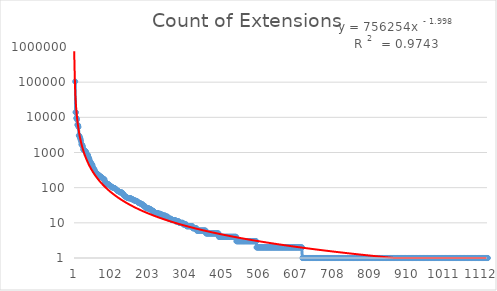
| Category | Count of Extensions |
|---|---|
| 0 | 104153 |
| 1 | 13996 |
| 2 | 13759 |
| 3 | 9446 |
| 4 | 9443 |
| 5 | 8591 |
| 6 | 6126 |
| 7 | 6024 |
| 8 | 5860 |
| 9 | 5290 |
| 10 | 3073 |
| 11 | 3002 |
| 12 | 2844 |
| 13 | 2682 |
| 14 | 2498 |
| 15 | 2293 |
| 16 | 2063 |
| 17 | 1717 |
| 18 | 1676 |
| 19 | 1636 |
| 20 | 1561 |
| 21 | 1460 |
| 22 | 1236 |
| 23 | 1194 |
| 24 | 1185 |
| 25 | 1151 |
| 26 | 1136 |
| 27 | 1109 |
| 28 | 1090 |
| 29 | 1051 |
| 30 | 1020 |
| 31 | 880 |
| 32 | 863 |
| 33 | 856 |
| 34 | 847 |
| 35 | 846 |
| 36 | 733 |
| 37 | 704 |
| 38 | 685 |
| 39 | 627 |
| 40 | 567 |
| 41 | 549 |
| 42 | 537 |
| 43 | 498 |
| 44 | 495 |
| 45 | 454 |
| 46 | 450 |
| 47 | 444 |
| 48 | 393 |
| 49 | 363 |
| 50 | 345 |
| 51 | 345 |
| 52 | 332 |
| 53 | 320 |
| 54 | 293 |
| 55 | 283 |
| 56 | 276 |
| 57 | 266 |
| 58 | 256 |
| 59 | 251 |
| 60 | 248 |
| 61 | 248 |
| 62 | 230 |
| 63 | 228 |
| 64 | 227 |
| 65 | 226 |
| 66 | 220 |
| 67 | 216 |
| 68 | 209 |
| 69 | 209 |
| 70 | 202 |
| 71 | 202 |
| 72 | 196 |
| 73 | 196 |
| 74 | 191 |
| 75 | 186 |
| 76 | 181 |
| 77 | 178 |
| 78 | 176 |
| 79 | 173 |
| 80 | 171 |
| 81 | 151 |
| 82 | 139 |
| 83 | 137 |
| 84 | 132 |
| 85 | 132 |
| 86 | 131 |
| 87 | 131 |
| 88 | 129 |
| 89 | 125 |
| 90 | 125 |
| 91 | 124 |
| 92 | 124 |
| 93 | 119 |
| 94 | 115 |
| 95 | 114 |
| 96 | 112 |
| 97 | 109 |
| 98 | 109 |
| 99 | 107 |
| 100 | 105 |
| 101 | 103 |
| 102 | 101 |
| 103 | 101 |
| 104 | 99 |
| 105 | 98 |
| 106 | 98 |
| 107 | 97 |
| 108 | 97 |
| 109 | 94 |
| 110 | 91 |
| 111 | 90 |
| 112 | 89 |
| 113 | 88 |
| 114 | 84 |
| 115 | 81 |
| 116 | 81 |
| 117 | 81 |
| 118 | 80 |
| 119 | 78 |
| 120 | 76 |
| 121 | 75 |
| 122 | 74 |
| 123 | 74 |
| 124 | 73 |
| 125 | 73 |
| 126 | 73 |
| 127 | 73 |
| 128 | 72 |
| 129 | 71 |
| 130 | 68 |
| 131 | 67 |
| 132 | 62 |
| 133 | 60 |
| 134 | 60 |
| 135 | 59 |
| 136 | 56 |
| 137 | 56 |
| 138 | 56 |
| 139 | 55 |
| 140 | 54 |
| 141 | 52 |
| 142 | 52 |
| 143 | 51 |
| 144 | 51 |
| 145 | 51 |
| 146 | 50 |
| 147 | 50 |
| 148 | 50 |
| 149 | 50 |
| 150 | 50 |
| 151 | 50 |
| 152 | 49 |
| 153 | 49 |
| 154 | 47 |
| 155 | 47 |
| 156 | 47 |
| 157 | 46 |
| 158 | 46 |
| 159 | 45 |
| 160 | 44 |
| 161 | 44 |
| 162 | 43 |
| 163 | 43 |
| 164 | 43 |
| 165 | 42 |
| 166 | 42 |
| 167 | 42 |
| 168 | 41 |
| 169 | 41 |
| 170 | 40 |
| 171 | 39 |
| 172 | 38 |
| 173 | 37 |
| 174 | 37 |
| 175 | 37 |
| 176 | 37 |
| 177 | 36 |
| 178 | 35 |
| 179 | 35 |
| 180 | 35 |
| 181 | 34 |
| 182 | 34 |
| 183 | 34 |
| 184 | 33 |
| 185 | 31 |
| 186 | 31 |
| 187 | 31 |
| 188 | 31 |
| 189 | 30 |
| 190 | 30 |
| 191 | 28 |
| 192 | 27 |
| 193 | 27 |
| 194 | 27 |
| 195 | 26 |
| 196 | 26 |
| 197 | 26 |
| 198 | 26 |
| 199 | 26 |
| 200 | 26 |
| 201 | 25 |
| 202 | 25 |
| 203 | 25 |
| 204 | 25 |
| 205 | 24 |
| 206 | 24 |
| 207 | 24 |
| 208 | 23 |
| 209 | 22 |
| 210 | 22 |
| 211 | 22 |
| 212 | 22 |
| 213 | 22 |
| 214 | 21 |
| 215 | 20 |
| 216 | 20 |
| 217 | 20 |
| 218 | 19 |
| 219 | 19 |
| 220 | 19 |
| 221 | 19 |
| 222 | 19 |
| 223 | 19 |
| 224 | 19 |
| 225 | 19 |
| 226 | 19 |
| 227 | 18 |
| 228 | 18 |
| 229 | 18 |
| 230 | 18 |
| 231 | 18 |
| 232 | 18 |
| 233 | 18 |
| 234 | 17 |
| 235 | 17 |
| 236 | 17 |
| 237 | 17 |
| 238 | 17 |
| 239 | 16 |
| 240 | 16 |
| 241 | 16 |
| 242 | 16 |
| 243 | 16 |
| 244 | 16 |
| 245 | 16 |
| 246 | 16 |
| 247 | 15 |
| 248 | 15 |
| 249 | 15 |
| 250 | 15 |
| 251 | 15 |
| 252 | 15 |
| 253 | 14 |
| 254 | 14 |
| 255 | 14 |
| 256 | 13 |
| 257 | 13 |
| 258 | 13 |
| 259 | 13 |
| 260 | 13 |
| 261 | 13 |
| 262 | 13 |
| 263 | 12 |
| 264 | 12 |
| 265 | 12 |
| 266 | 12 |
| 267 | 12 |
| 268 | 12 |
| 269 | 12 |
| 270 | 12 |
| 271 | 12 |
| 272 | 12 |
| 273 | 12 |
| 274 | 11 |
| 275 | 11 |
| 276 | 11 |
| 277 | 11 |
| 278 | 11 |
| 279 | 11 |
| 280 | 11 |
| 281 | 11 |
| 282 | 11 |
| 283 | 11 |
| 284 | 10 |
| 285 | 10 |
| 286 | 10 |
| 287 | 10 |
| 288 | 10 |
| 289 | 10 |
| 290 | 10 |
| 291 | 10 |
| 292 | 10 |
| 293 | 10 |
| 294 | 10 |
| 295 | 9 |
| 296 | 9 |
| 297 | 9 |
| 298 | 9 |
| 299 | 9 |
| 300 | 9 |
| 301 | 9 |
| 302 | 9 |
| 303 | 9 |
| 304 | 8 |
| 305 | 8 |
| 306 | 8 |
| 307 | 8 |
| 308 | 8 |
| 309 | 8 |
| 310 | 8 |
| 311 | 8 |
| 312 | 8 |
| 313 | 8 |
| 314 | 8 |
| 315 | 8 |
| 316 | 8 |
| 317 | 8 |
| 318 | 8 |
| 319 | 8 |
| 320 | 8 |
| 321 | 7 |
| 322 | 7 |
| 323 | 7 |
| 324 | 7 |
| 325 | 7 |
| 326 | 7 |
| 327 | 7 |
| 328 | 7 |
| 329 | 7 |
| 330 | 7 |
| 331 | 7 |
| 332 | 6 |
| 333 | 6 |
| 334 | 6 |
| 335 | 6 |
| 336 | 6 |
| 337 | 6 |
| 338 | 6 |
| 339 | 6 |
| 340 | 6 |
| 341 | 6 |
| 342 | 6 |
| 343 | 6 |
| 344 | 6 |
| 345 | 6 |
| 346 | 6 |
| 347 | 6 |
| 348 | 6 |
| 349 | 6 |
| 350 | 6 |
| 351 | 6 |
| 352 | 6 |
| 353 | 6 |
| 354 | 6 |
| 355 | 6 |
| 356 | 6 |
| 357 | 5 |
| 358 | 5 |
| 359 | 5 |
| 360 | 5 |
| 361 | 5 |
| 362 | 5 |
| 363 | 5 |
| 364 | 5 |
| 365 | 5 |
| 366 | 5 |
| 367 | 5 |
| 368 | 5 |
| 369 | 5 |
| 370 | 5 |
| 371 | 5 |
| 372 | 5 |
| 373 | 5 |
| 374 | 5 |
| 375 | 5 |
| 376 | 5 |
| 377 | 5 |
| 378 | 5 |
| 379 | 5 |
| 380 | 5 |
| 381 | 5 |
| 382 | 5 |
| 383 | 5 |
| 384 | 5 |
| 385 | 5 |
| 386 | 5 |
| 387 | 5 |
| 388 | 5 |
| 389 | 5 |
| 390 | 5 |
| 391 | 5 |
| 392 | 4 |
| 393 | 4 |
| 394 | 4 |
| 395 | 4 |
| 396 | 4 |
| 397 | 4 |
| 398 | 4 |
| 399 | 4 |
| 400 | 4 |
| 401 | 4 |
| 402 | 4 |
| 403 | 4 |
| 404 | 4 |
| 405 | 4 |
| 406 | 4 |
| 407 | 4 |
| 408 | 4 |
| 409 | 4 |
| 410 | 4 |
| 411 | 4 |
| 412 | 4 |
| 413 | 4 |
| 414 | 4 |
| 415 | 4 |
| 416 | 4 |
| 417 | 4 |
| 418 | 4 |
| 419 | 4 |
| 420 | 4 |
| 421 | 4 |
| 422 | 4 |
| 423 | 4 |
| 424 | 4 |
| 425 | 4 |
| 426 | 4 |
| 427 | 4 |
| 428 | 4 |
| 429 | 4 |
| 430 | 4 |
| 431 | 4 |
| 432 | 4 |
| 433 | 4 |
| 434 | 4 |
| 435 | 4 |
| 436 | 4 |
| 437 | 4 |
| 438 | 4 |
| 439 | 4 |
| 440 | 3 |
| 441 | 3 |
| 442 | 3 |
| 443 | 3 |
| 444 | 3 |
| 445 | 3 |
| 446 | 3 |
| 447 | 3 |
| 448 | 3 |
| 449 | 3 |
| 450 | 3 |
| 451 | 3 |
| 452 | 3 |
| 453 | 3 |
| 454 | 3 |
| 455 | 3 |
| 456 | 3 |
| 457 | 3 |
| 458 | 3 |
| 459 | 3 |
| 460 | 3 |
| 461 | 3 |
| 462 | 3 |
| 463 | 3 |
| 464 | 3 |
| 465 | 3 |
| 466 | 3 |
| 467 | 3 |
| 468 | 3 |
| 469 | 3 |
| 470 | 3 |
| 471 | 3 |
| 472 | 3 |
| 473 | 3 |
| 474 | 3 |
| 475 | 3 |
| 476 | 3 |
| 477 | 3 |
| 478 | 3 |
| 479 | 3 |
| 480 | 3 |
| 481 | 3 |
| 482 | 3 |
| 483 | 3 |
| 484 | 3 |
| 485 | 3 |
| 486 | 3 |
| 487 | 3 |
| 488 | 3 |
| 489 | 3 |
| 490 | 3 |
| 491 | 3 |
| 492 | 3 |
| 493 | 3 |
| 494 | 3 |
| 495 | 2 |
| 496 | 2 |
| 497 | 2 |
| 498 | 2 |
| 499 | 2 |
| 500 | 2 |
| 501 | 2 |
| 502 | 2 |
| 503 | 2 |
| 504 | 2 |
| 505 | 2 |
| 506 | 2 |
| 507 | 2 |
| 508 | 2 |
| 509 | 2 |
| 510 | 2 |
| 511 | 2 |
| 512 | 2 |
| 513 | 2 |
| 514 | 2 |
| 515 | 2 |
| 516 | 2 |
| 517 | 2 |
| 518 | 2 |
| 519 | 2 |
| 520 | 2 |
| 521 | 2 |
| 522 | 2 |
| 523 | 2 |
| 524 | 2 |
| 525 | 2 |
| 526 | 2 |
| 527 | 2 |
| 528 | 2 |
| 529 | 2 |
| 530 | 2 |
| 531 | 2 |
| 532 | 2 |
| 533 | 2 |
| 534 | 2 |
| 535 | 2 |
| 536 | 2 |
| 537 | 2 |
| 538 | 2 |
| 539 | 2 |
| 540 | 2 |
| 541 | 2 |
| 542 | 2 |
| 543 | 2 |
| 544 | 2 |
| 545 | 2 |
| 546 | 2 |
| 547 | 2 |
| 548 | 2 |
| 549 | 2 |
| 550 | 2 |
| 551 | 2 |
| 552 | 2 |
| 553 | 2 |
| 554 | 2 |
| 555 | 2 |
| 556 | 2 |
| 557 | 2 |
| 558 | 2 |
| 559 | 2 |
| 560 | 2 |
| 561 | 2 |
| 562 | 2 |
| 563 | 2 |
| 564 | 2 |
| 565 | 2 |
| 566 | 2 |
| 567 | 2 |
| 568 | 2 |
| 569 | 2 |
| 570 | 2 |
| 571 | 2 |
| 572 | 2 |
| 573 | 2 |
| 574 | 2 |
| 575 | 2 |
| 576 | 2 |
| 577 | 2 |
| 578 | 2 |
| 579 | 2 |
| 580 | 2 |
| 581 | 2 |
| 582 | 2 |
| 583 | 2 |
| 584 | 2 |
| 585 | 2 |
| 586 | 2 |
| 587 | 2 |
| 588 | 2 |
| 589 | 2 |
| 590 | 2 |
| 591 | 2 |
| 592 | 2 |
| 593 | 2 |
| 594 | 2 |
| 595 | 2 |
| 596 | 2 |
| 597 | 2 |
| 598 | 2 |
| 599 | 2 |
| 600 | 2 |
| 601 | 2 |
| 602 | 2 |
| 603 | 2 |
| 604 | 2 |
| 605 | 2 |
| 606 | 2 |
| 607 | 2 |
| 608 | 2 |
| 609 | 2 |
| 610 | 2 |
| 611 | 2 |
| 612 | 2 |
| 613 | 2 |
| 614 | 2 |
| 615 | 2 |
| 616 | 2 |
| 617 | 2 |
| 618 | 2 |
| 619 | 2 |
| 620 | 1 |
| 621 | 1 |
| 622 | 1 |
| 623 | 1 |
| 624 | 1 |
| 625 | 1 |
| 626 | 1 |
| 627 | 1 |
| 628 | 1 |
| 629 | 1 |
| 630 | 1 |
| 631 | 1 |
| 632 | 1 |
| 633 | 1 |
| 634 | 1 |
| 635 | 1 |
| 636 | 1 |
| 637 | 1 |
| 638 | 1 |
| 639 | 1 |
| 640 | 1 |
| 641 | 1 |
| 642 | 1 |
| 643 | 1 |
| 644 | 1 |
| 645 | 1 |
| 646 | 1 |
| 647 | 1 |
| 648 | 1 |
| 649 | 1 |
| 650 | 1 |
| 651 | 1 |
| 652 | 1 |
| 653 | 1 |
| 654 | 1 |
| 655 | 1 |
| 656 | 1 |
| 657 | 1 |
| 658 | 1 |
| 659 | 1 |
| 660 | 1 |
| 661 | 1 |
| 662 | 1 |
| 663 | 1 |
| 664 | 1 |
| 665 | 1 |
| 666 | 1 |
| 667 | 1 |
| 668 | 1 |
| 669 | 1 |
| 670 | 1 |
| 671 | 1 |
| 672 | 1 |
| 673 | 1 |
| 674 | 1 |
| 675 | 1 |
| 676 | 1 |
| 677 | 1 |
| 678 | 1 |
| 679 | 1 |
| 680 | 1 |
| 681 | 1 |
| 682 | 1 |
| 683 | 1 |
| 684 | 1 |
| 685 | 1 |
| 686 | 1 |
| 687 | 1 |
| 688 | 1 |
| 689 | 1 |
| 690 | 1 |
| 691 | 1 |
| 692 | 1 |
| 693 | 1 |
| 694 | 1 |
| 695 | 1 |
| 696 | 1 |
| 697 | 1 |
| 698 | 1 |
| 699 | 1 |
| 700 | 1 |
| 701 | 1 |
| 702 | 1 |
| 703 | 1 |
| 704 | 1 |
| 705 | 1 |
| 706 | 1 |
| 707 | 1 |
| 708 | 1 |
| 709 | 1 |
| 710 | 1 |
| 711 | 1 |
| 712 | 1 |
| 713 | 1 |
| 714 | 1 |
| 715 | 1 |
| 716 | 1 |
| 717 | 1 |
| 718 | 1 |
| 719 | 1 |
| 720 | 1 |
| 721 | 1 |
| 722 | 1 |
| 723 | 1 |
| 724 | 1 |
| 725 | 1 |
| 726 | 1 |
| 727 | 1 |
| 728 | 1 |
| 729 | 1 |
| 730 | 1 |
| 731 | 1 |
| 732 | 1 |
| 733 | 1 |
| 734 | 1 |
| 735 | 1 |
| 736 | 1 |
| 737 | 1 |
| 738 | 1 |
| 739 | 1 |
| 740 | 1 |
| 741 | 1 |
| 742 | 1 |
| 743 | 1 |
| 744 | 1 |
| 745 | 1 |
| 746 | 1 |
| 747 | 1 |
| 748 | 1 |
| 749 | 1 |
| 750 | 1 |
| 751 | 1 |
| 752 | 1 |
| 753 | 1 |
| 754 | 1 |
| 755 | 1 |
| 756 | 1 |
| 757 | 1 |
| 758 | 1 |
| 759 | 1 |
| 760 | 1 |
| 761 | 1 |
| 762 | 1 |
| 763 | 1 |
| 764 | 1 |
| 765 | 1 |
| 766 | 1 |
| 767 | 1 |
| 768 | 1 |
| 769 | 1 |
| 770 | 1 |
| 771 | 1 |
| 772 | 1 |
| 773 | 1 |
| 774 | 1 |
| 775 | 1 |
| 776 | 1 |
| 777 | 1 |
| 778 | 1 |
| 779 | 1 |
| 780 | 1 |
| 781 | 1 |
| 782 | 1 |
| 783 | 1 |
| 784 | 1 |
| 785 | 1 |
| 786 | 1 |
| 787 | 1 |
| 788 | 1 |
| 789 | 1 |
| 790 | 1 |
| 791 | 1 |
| 792 | 1 |
| 793 | 1 |
| 794 | 1 |
| 795 | 1 |
| 796 | 1 |
| 797 | 1 |
| 798 | 1 |
| 799 | 1 |
| 800 | 1 |
| 801 | 1 |
| 802 | 1 |
| 803 | 1 |
| 804 | 1 |
| 805 | 1 |
| 806 | 1 |
| 807 | 1 |
| 808 | 1 |
| 809 | 1 |
| 810 | 1 |
| 811 | 1 |
| 812 | 1 |
| 813 | 1 |
| 814 | 1 |
| 815 | 1 |
| 816 | 1 |
| 817 | 1 |
| 818 | 1 |
| 819 | 1 |
| 820 | 1 |
| 821 | 1 |
| 822 | 1 |
| 823 | 1 |
| 824 | 1 |
| 825 | 1 |
| 826 | 1 |
| 827 | 1 |
| 828 | 1 |
| 829 | 1 |
| 830 | 1 |
| 831 | 1 |
| 832 | 1 |
| 833 | 1 |
| 834 | 1 |
| 835 | 1 |
| 836 | 1 |
| 837 | 1 |
| 838 | 1 |
| 839 | 1 |
| 840 | 1 |
| 841 | 1 |
| 842 | 1 |
| 843 | 1 |
| 844 | 1 |
| 845 | 1 |
| 846 | 1 |
| 847 | 1 |
| 848 | 1 |
| 849 | 1 |
| 850 | 1 |
| 851 | 1 |
| 852 | 1 |
| 853 | 1 |
| 854 | 1 |
| 855 | 1 |
| 856 | 1 |
| 857 | 1 |
| 858 | 1 |
| 859 | 1 |
| 860 | 1 |
| 861 | 1 |
| 862 | 1 |
| 863 | 1 |
| 864 | 1 |
| 865 | 1 |
| 866 | 1 |
| 867 | 1 |
| 868 | 1 |
| 869 | 1 |
| 870 | 1 |
| 871 | 1 |
| 872 | 1 |
| 873 | 1 |
| 874 | 1 |
| 875 | 1 |
| 876 | 1 |
| 877 | 1 |
| 878 | 1 |
| 879 | 1 |
| 880 | 1 |
| 881 | 1 |
| 882 | 1 |
| 883 | 1 |
| 884 | 1 |
| 885 | 1 |
| 886 | 1 |
| 887 | 1 |
| 888 | 1 |
| 889 | 1 |
| 890 | 1 |
| 891 | 1 |
| 892 | 1 |
| 893 | 1 |
| 894 | 1 |
| 895 | 1 |
| 896 | 1 |
| 897 | 1 |
| 898 | 1 |
| 899 | 1 |
| 900 | 1 |
| 901 | 1 |
| 902 | 1 |
| 903 | 1 |
| 904 | 1 |
| 905 | 1 |
| 906 | 1 |
| 907 | 1 |
| 908 | 1 |
| 909 | 1 |
| 910 | 1 |
| 911 | 1 |
| 912 | 1 |
| 913 | 1 |
| 914 | 1 |
| 915 | 1 |
| 916 | 1 |
| 917 | 1 |
| 918 | 1 |
| 919 | 1 |
| 920 | 1 |
| 921 | 1 |
| 922 | 1 |
| 923 | 1 |
| 924 | 1 |
| 925 | 1 |
| 926 | 1 |
| 927 | 1 |
| 928 | 1 |
| 929 | 1 |
| 930 | 1 |
| 931 | 1 |
| 932 | 1 |
| 933 | 1 |
| 934 | 1 |
| 935 | 1 |
| 936 | 1 |
| 937 | 1 |
| 938 | 1 |
| 939 | 1 |
| 940 | 1 |
| 941 | 1 |
| 942 | 1 |
| 943 | 1 |
| 944 | 1 |
| 945 | 1 |
| 946 | 1 |
| 947 | 1 |
| 948 | 1 |
| 949 | 1 |
| 950 | 1 |
| 951 | 1 |
| 952 | 1 |
| 953 | 1 |
| 954 | 1 |
| 955 | 1 |
| 956 | 1 |
| 957 | 1 |
| 958 | 1 |
| 959 | 1 |
| 960 | 1 |
| 961 | 1 |
| 962 | 1 |
| 963 | 1 |
| 964 | 1 |
| 965 | 1 |
| 966 | 1 |
| 967 | 1 |
| 968 | 1 |
| 969 | 1 |
| 970 | 1 |
| 971 | 1 |
| 972 | 1 |
| 973 | 1 |
| 974 | 1 |
| 975 | 1 |
| 976 | 1 |
| 977 | 1 |
| 978 | 1 |
| 979 | 1 |
| 980 | 1 |
| 981 | 1 |
| 982 | 1 |
| 983 | 1 |
| 984 | 1 |
| 985 | 1 |
| 986 | 1 |
| 987 | 1 |
| 988 | 1 |
| 989 | 1 |
| 990 | 1 |
| 991 | 1 |
| 992 | 1 |
| 993 | 1 |
| 994 | 1 |
| 995 | 1 |
| 996 | 1 |
| 997 | 1 |
| 998 | 1 |
| 999 | 1 |
| 1000 | 1 |
| 1001 | 1 |
| 1002 | 1 |
| 1003 | 1 |
| 1004 | 1 |
| 1005 | 1 |
| 1006 | 1 |
| 1007 | 1 |
| 1008 | 1 |
| 1009 | 1 |
| 1010 | 1 |
| 1011 | 1 |
| 1012 | 1 |
| 1013 | 1 |
| 1014 | 1 |
| 1015 | 1 |
| 1016 | 1 |
| 1017 | 1 |
| 1018 | 1 |
| 1019 | 1 |
| 1020 | 1 |
| 1021 | 1 |
| 1022 | 1 |
| 1023 | 1 |
| 1024 | 1 |
| 1025 | 1 |
| 1026 | 1 |
| 1027 | 1 |
| 1028 | 1 |
| 1029 | 1 |
| 1030 | 1 |
| 1031 | 1 |
| 1032 | 1 |
| 1033 | 1 |
| 1034 | 1 |
| 1035 | 1 |
| 1036 | 1 |
| 1037 | 1 |
| 1038 | 1 |
| 1039 | 1 |
| 1040 | 1 |
| 1041 | 1 |
| 1042 | 1 |
| 1043 | 1 |
| 1044 | 1 |
| 1045 | 1 |
| 1046 | 1 |
| 1047 | 1 |
| 1048 | 1 |
| 1049 | 1 |
| 1050 | 1 |
| 1051 | 1 |
| 1052 | 1 |
| 1053 | 1 |
| 1054 | 1 |
| 1055 | 1 |
| 1056 | 1 |
| 1057 | 1 |
| 1058 | 1 |
| 1059 | 1 |
| 1060 | 1 |
| 1061 | 1 |
| 1062 | 1 |
| 1063 | 1 |
| 1064 | 1 |
| 1065 | 1 |
| 1066 | 1 |
| 1067 | 1 |
| 1068 | 1 |
| 1069 | 1 |
| 1070 | 1 |
| 1071 | 1 |
| 1072 | 1 |
| 1073 | 1 |
| 1074 | 1 |
| 1075 | 1 |
| 1076 | 1 |
| 1077 | 1 |
| 1078 | 1 |
| 1079 | 1 |
| 1080 | 1 |
| 1081 | 1 |
| 1082 | 1 |
| 1083 | 1 |
| 1084 | 1 |
| 1085 | 1 |
| 1086 | 1 |
| 1087 | 1 |
| 1088 | 1 |
| 1089 | 1 |
| 1090 | 1 |
| 1091 | 1 |
| 1092 | 1 |
| 1093 | 1 |
| 1094 | 1 |
| 1095 | 1 |
| 1096 | 1 |
| 1097 | 1 |
| 1098 | 1 |
| 1099 | 1 |
| 1100 | 1 |
| 1101 | 1 |
| 1102 | 1 |
| 1103 | 1 |
| 1104 | 1 |
| 1105 | 1 |
| 1106 | 1 |
| 1107 | 1 |
| 1108 | 1 |
| 1109 | 1 |
| 1110 | 1 |
| 1111 | 1 |
| 1112 | 1 |
| 1113 | 1 |
| 1114 | 1 |
| 1115 | 1 |
| 1116 | 1 |
| 1117 | 1 |
| 1118 | 1 |
| 1119 | 1 |
| 1120 | 1 |
| 1121 | 1 |
| 1122 | 1 |
| 1123 | 1 |
| 1124 | 1 |
| 1125 | 1 |
| 1126 | 1 |